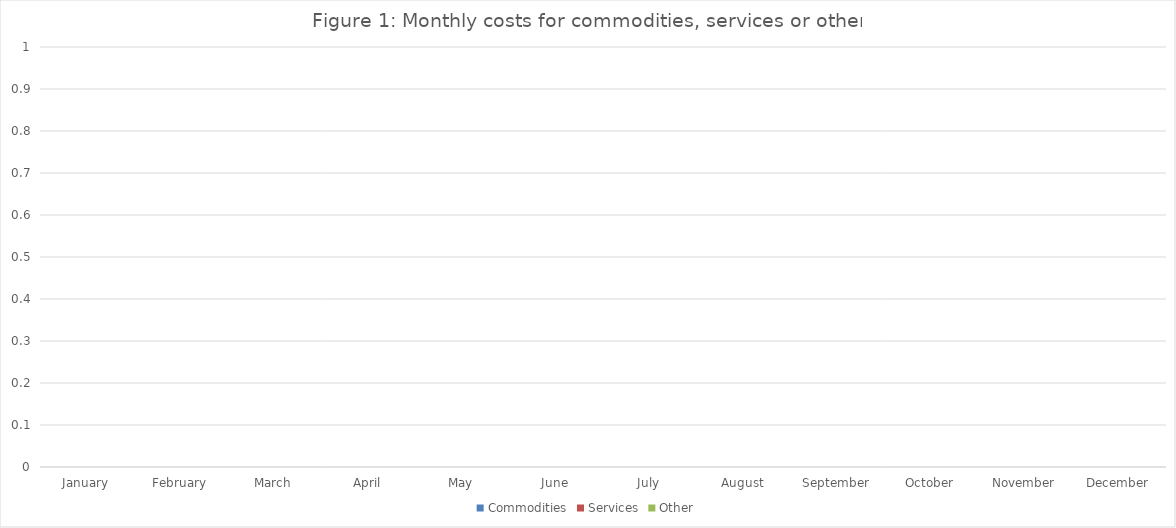
| Category | Commodities | Services | Other |
|---|---|---|---|
| January | 0 | 0 | 0 |
| February | 0 | 0 | 0 |
| March | 0 | 0 | 0 |
| April | 0 | 0 | 0 |
| May | 0 | 0 | 0 |
| June | 0 | 0 | 0 |
| July | 0 | 0 | 0 |
| August | 0 | 0 | 0 |
| September | 0 | 0 | 0 |
| October | 0 | 0 | 0 |
| November | 0 | 0 | 0 |
| December | 0 | 0 | 0 |